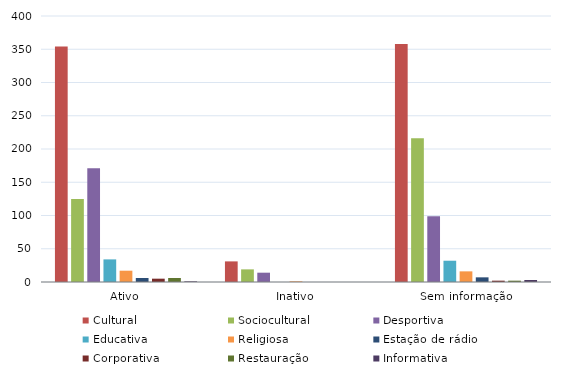
| Category | Cultural | Sociocultural | Desportiva | Educativa | Religiosa | Estação de rádio | Corporativa | Restauração | Informativa |
|---|---|---|---|---|---|---|---|---|---|
| Ativo | 354 | 125 | 171 | 34 | 17 | 6 | 5 | 6 | 1 |
| Inativo | 31 | 19 | 14 | 0 | 1 | 0 | 0 | 0 | 0 |
| Sem informação | 358 | 216 | 99 | 32 | 16 | 7 | 2 | 2 | 3 |